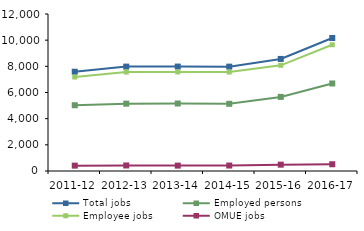
| Category | Total jobs | Employed persons | Employee jobs | OMUE jobs |
|---|---|---|---|---|
| 2011-12 | 7587 | 5027 | 7182 | 410 |
| 2012-13 | 7979 | 5146 | 7560 | 423 |
| 2013-14 | 7981 | 5159 | 7569 | 412 |
| 2014-15 | 7976 | 5135 | 7562 | 418 |
| 2015-16 | 8566 | 5664 | 8078 | 485 |
| 2016-17 | 10165 | 6691 | 9648 | 517 |